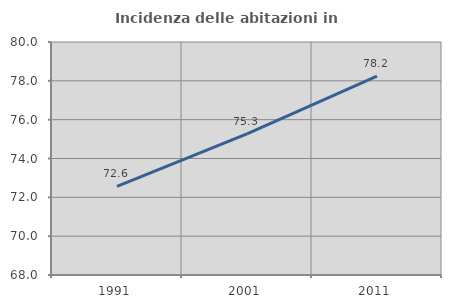
| Category | Incidenza delle abitazioni in proprietà  |
|---|---|
| 1991.0 | 72.563 |
| 2001.0 | 75.265 |
| 2011.0 | 78.246 |